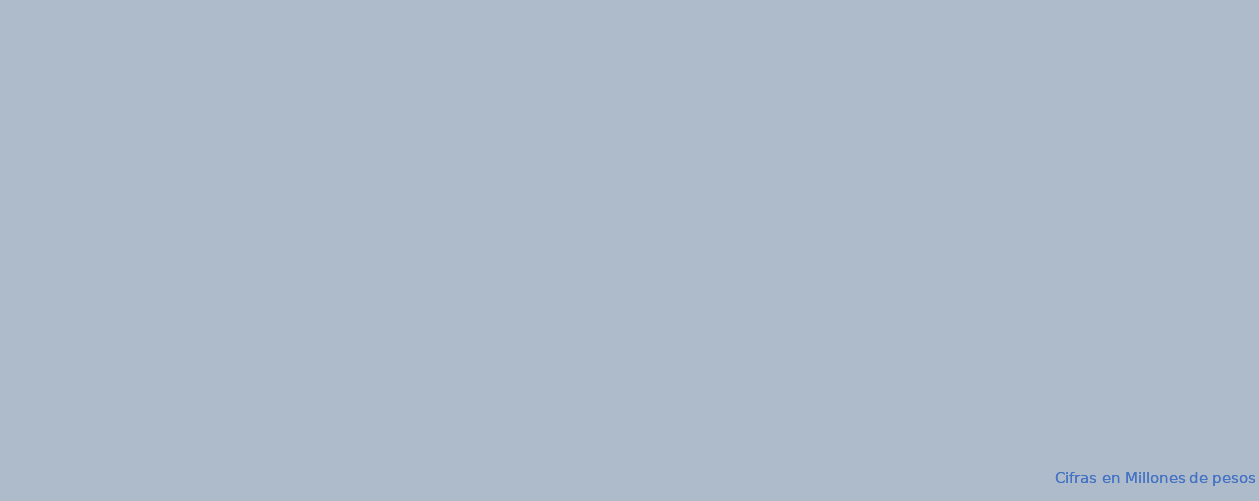
| Category | APROPIACION | COMPROMISOS |  OBLIGACIONES |  PAGOS |
|---|---|---|---|---|
| A-FUNCIONAMIENTO | 99785.985 | 44704.424 | 38564.482 | 37669.063 |
| B-SERVICIO DE LA DEUDA PÚBLICA | 1167604.335 | 697064.472 | 697064.472 | 697064.472 |
| C- INVERSION | 4505182.025 | 4342564.54 | 350489.476 | 349873.411 |